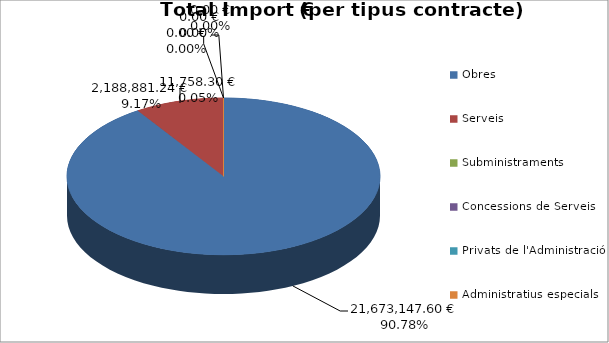
| Category | Total preu              (amb iva) |
|---|---|
| Obres | 21673147.598 |
| Serveis | 2188881.24 |
| Subministraments | 11758.296 |
| Concessions de Serveis | 0 |
| Privats de l'Administració | 0 |
| Administratius especials | 0 |